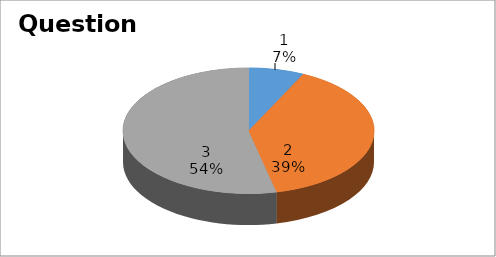
| Category | Series 0 |
|---|---|
| 0 | 2 |
| 1 | 11 |
| 2 | 15 |